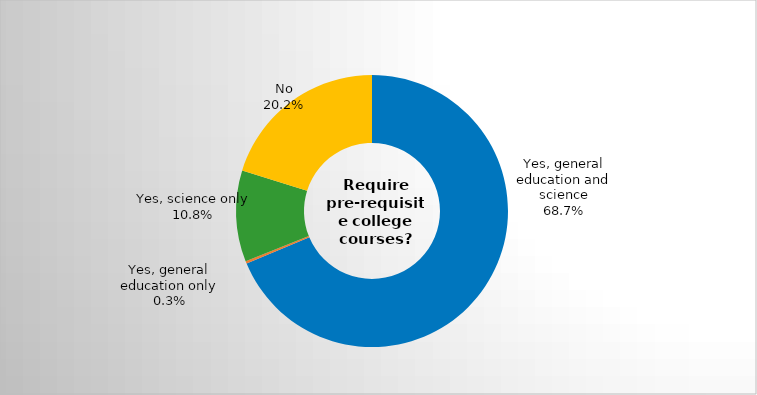
| Category | Series 0 |
|---|---|
| Yes, general education and science | 0.687 |
| Yes, general education only | 0.003 |
| Yes, science only | 0.108 |
| No | 0.202 |